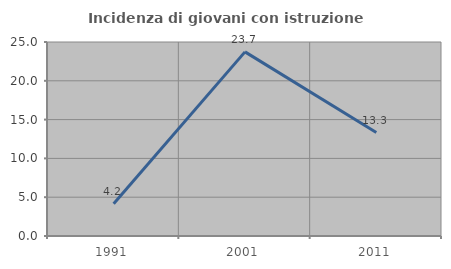
| Category | Incidenza di giovani con istruzione universitaria |
|---|---|
| 1991.0 | 4.167 |
| 2001.0 | 23.729 |
| 2011.0 | 13.333 |